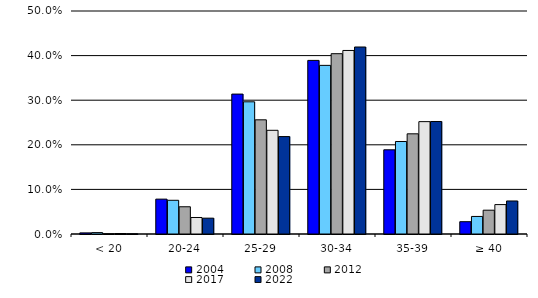
| Category | 2004 | 2008 | 2012 | 2017 | 2022 |
|---|---|---|---|---|---|
| < 20 | 0.002 | 0.003 | 0.001 | 0.001 | 0.001 |
| 20-24 | 0.078 | 0.076 | 0.061 | 0.037 | 0.036 |
| 25-29 | 0.314 | 0.296 | 0.256 | 0.232 | 0.218 |
| 30-34 | 0.389 | 0.378 | 0.404 | 0.412 | 0.419 |
| 35-39 | 0.189 | 0.207 | 0.225 | 0.252 | 0.252 |
| ≥ 40 | 0.028 | 0.039 | 0.053 | 0.066 | 0.074 |